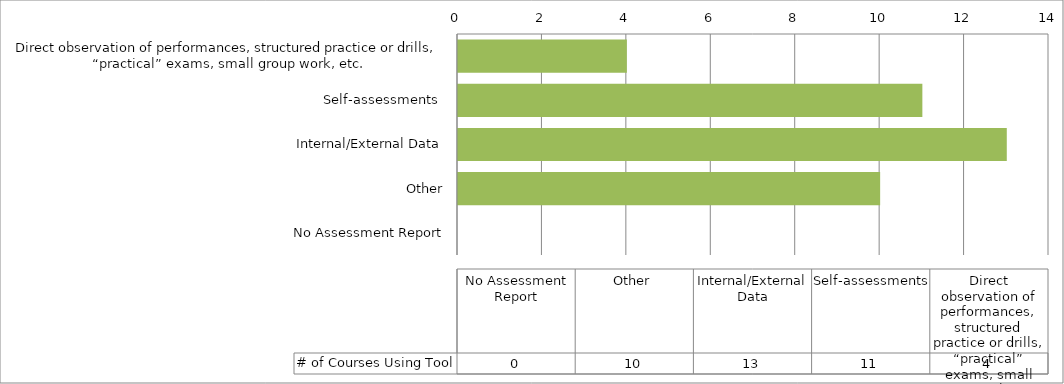
| Category | # of Courses Using Tool |
|---|---|
| Direct observation of performances, structured practice or drills, “practical” exams, small group work, etc.
  | 4 |
| Self-assessments  | 11 |
| Internal/External Data | 13 |
| Other | 10 |
| No Assessment Report | 0 |